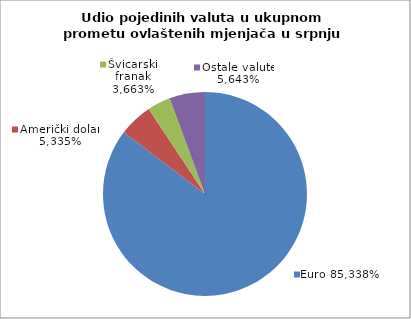
| Category | EUR |
|---|---|
| 0 | 0.853 |
| 1 | 0.054 |
| 2 | 0.037 |
| 3 | 0.056 |